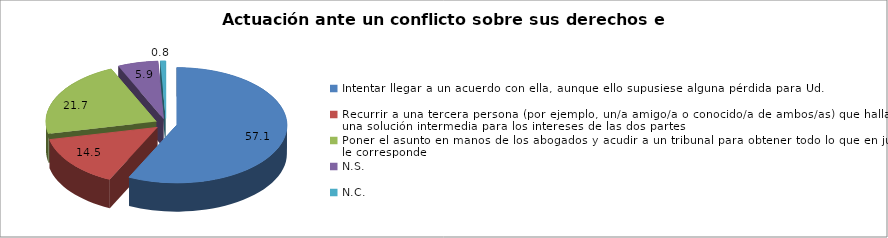
| Category | % |
|---|---|
| Intentar llegar a un acuerdo con ella, aunque ello supusiese alguna pérdida para Ud. | 57.1 |
| Recurrir a una tercera persona (por ejemplo, un/a amigo/a o conocido/a de ambos/as) que hallara una solución intermedia para los intereses de las dos partes | 14.5 |
| Poner el asunto en manos de los abogados y acudir a un tribunal para obtener todo lo que en justicia le corresponde | 21.7 |
| N.S.  | 5.9 |
| N.C.  | 0.8 |